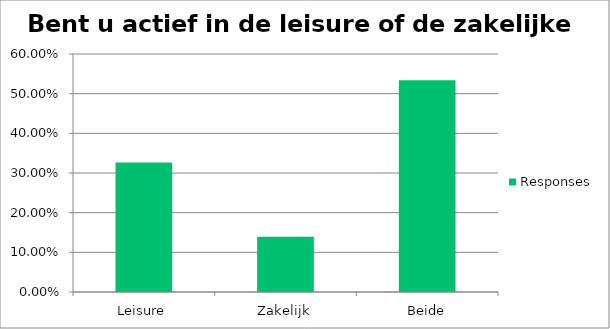
| Category | Responses |
|---|---|
| Leisure | 0.327 |
| Zakelijk | 0.139 |
| Beide | 0.534 |